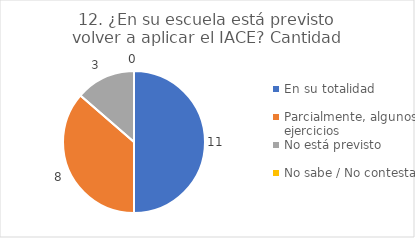
| Category | 12. ¿En su escuela está previsto volver a aplicar el IACE? |
|---|---|
| En su totalidad  | 0.5 |
| Parcialmente, algunos ejercicios  | 0.364 |
| No está previsto  | 0.136 |
| No sabe / No contesta | 0 |